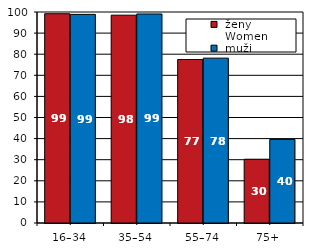
| Category |  ženy 
 Women |  muži 
 Men |
|---|---|---|
| 16–34 | 99.184 | 98.871 |
| 35–54 | 98.496 | 99.072 |
| 55–74 | 77.482 | 78.136 |
| 75+ | 30.223 | 39.612 |